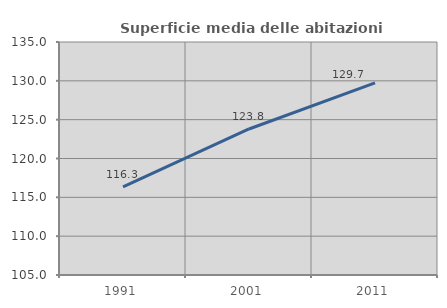
| Category | Superficie media delle abitazioni occupate |
|---|---|
| 1991.0 | 116.35 |
| 2001.0 | 123.802 |
| 2011.0 | 129.728 |